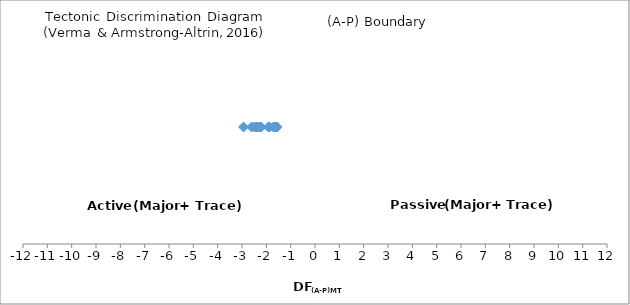
| Category | PFB |
|---|---|
| -1.911402310343524 | 1 |
| -2.39645917297943 | 1 |
| -1.6213636192807463 | 1 |
| -2.4783259545062712 | 1 |
| -1.559378258492158 | 1 |
| -2.2642552552625084 | 1 |
| -1.7019483388126169 | 1 |
| -2.6020356488297463 | 1 |
| -1.8715215421529106 | 1 |
| -1.6379282565436188 | 1 |
| -2.355029497149509 | 1 |
| -2.229409305921857 | 1 |
| -1.579255372831982 | 1 |
| -1.674536115262688 | 1 |
| -2.2143222370802356 | 1 |
| -2.937778015388316 | 1 |